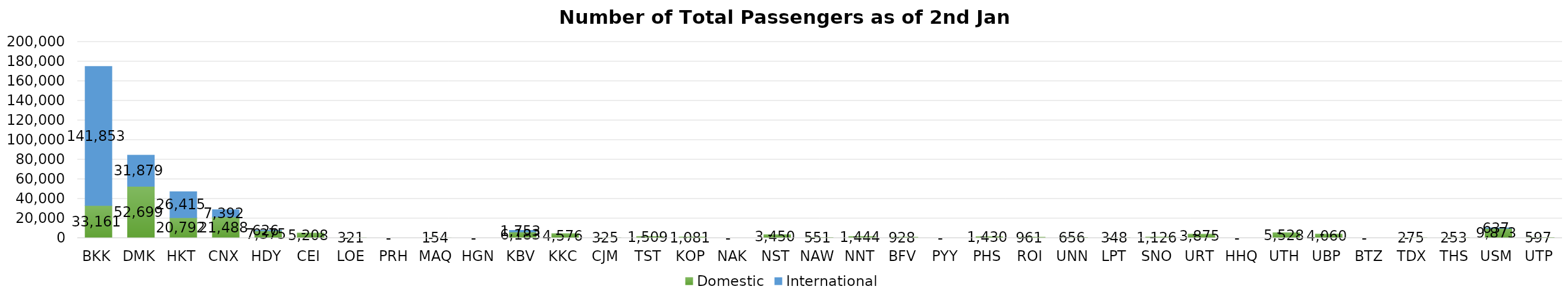
| Category | Domestic | International |
|---|---|---|
| BKK | 33161 | 141853 |
| DMK | 52699 | 31879 |
| HKT | 20792 | 26415 |
| CNX | 21488 | 7392 |
| HDY | 7375 | 626 |
| CEI | 5208 | 0 |
| LOE | 321 | 0 |
| PRH | 0 | 0 |
| MAQ | 154 | 0 |
| HGN | 0 | 0 |
| KBV | 6183 | 1753 |
| KKC | 4576 | 0 |
| CJM | 325 | 0 |
| TST | 1509 | 0 |
| KOP | 1081 | 0 |
| NAK | 0 | 0 |
| NST | 3450 | 0 |
| NAW | 551 | 0 |
| NNT | 1444 | 0 |
| BFV | 928 | 0 |
| PYY | 0 | 0 |
| PHS | 1430 | 0 |
| ROI | 961 | 0 |
| UNN | 656 | 0 |
| LPT | 348 | 0 |
| SNO | 1126 | 0 |
| URT | 3875 | 0 |
| HHQ | 0 | 0 |
| UTH | 5528 | 0 |
| UBP | 4060 | 0 |
| BTZ | 0 | 0 |
| TDX | 275 | 0 |
| THS | 253 | 0 |
| USM | 9873 | 637 |
| UTP | 597 | 0 |